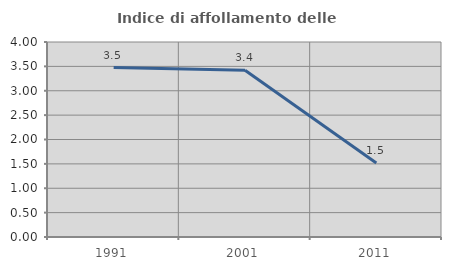
| Category | Indice di affollamento delle abitazioni  |
|---|---|
| 1991.0 | 3.475 |
| 2001.0 | 3.422 |
| 2011.0 | 1.52 |